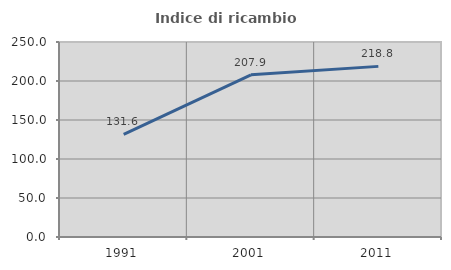
| Category | Indice di ricambio occupazionale  |
|---|---|
| 1991.0 | 131.579 |
| 2001.0 | 207.895 |
| 2011.0 | 218.75 |